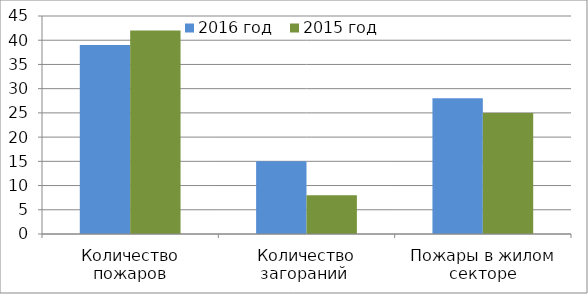
| Category | 2016 год | 2015 год |
|---|---|---|
| Количество пожаров | 39 | 42 |
| Количество загораний  | 15 | 8 |
| Пожары в жилом секторе | 28 | 25 |